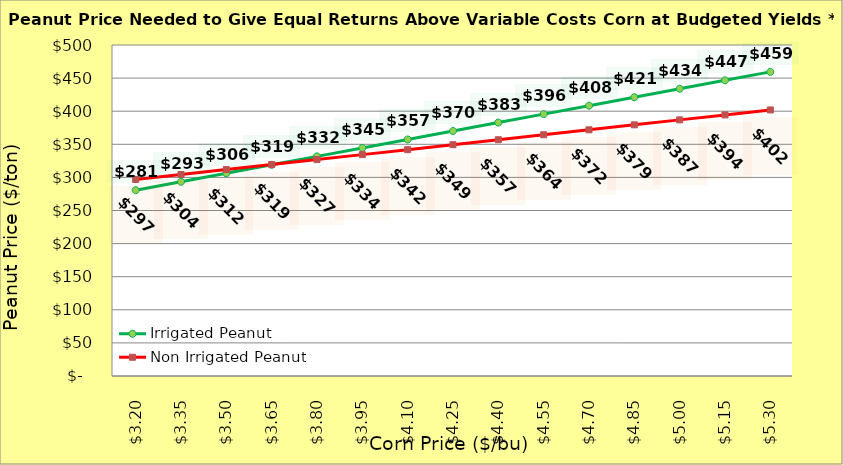
| Category | Irrigated Peanut | Non Irrigated Peanut |
|---|---|---|
| 3.2 | 280.685 | 296.894 |
| 3.35 | 293.451 | 304.394 |
| 3.5 | 306.217 | 311.894 |
| 3.65 | 318.983 | 319.394 |
| 3.8 | 331.749 | 326.894 |
| 3.9499999999999997 | 344.515 | 334.394 |
| 4.1 | 357.281 | 341.894 |
| 4.25 | 370.047 | 349.394 |
| 4.4 | 382.813 | 356.894 |
| 4.550000000000001 | 395.579 | 364.394 |
| 4.700000000000001 | 408.345 | 371.894 |
| 4.850000000000001 | 421.111 | 379.394 |
| 5.000000000000002 | 433.877 | 386.894 |
| 5.150000000000002 | 446.642 | 394.394 |
| 5.3000000000000025 | 459.408 | 401.894 |